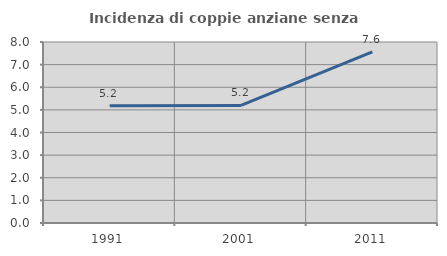
| Category | Incidenza di coppie anziane senza figli  |
|---|---|
| 1991.0 | 5.184 |
| 2001.0 | 5.198 |
| 2011.0 | 7.559 |